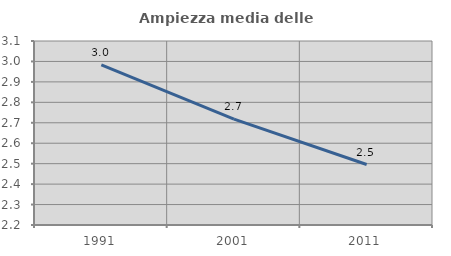
| Category | Ampiezza media delle famiglie |
|---|---|
| 1991.0 | 2.983 |
| 2001.0 | 2.718 |
| 2011.0 | 2.496 |